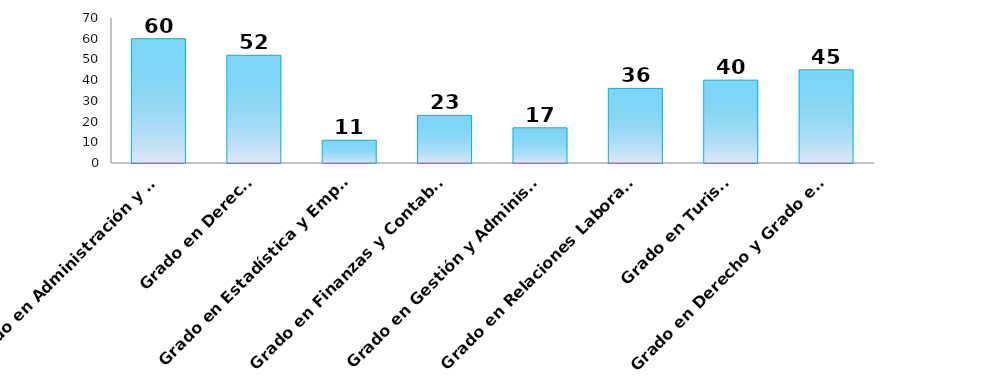
| Category | Series 0 |
|---|---|
| Grado en Administración y Dirección de Empresas | 60 |
| Grado en Derecho | 52 |
| Grado en Estadística y Empresa | 11 |
| Grado en Finanzas y Contabiilidad | 23 |
| Grado en Gestión y Administración Pública | 17 |
| Grado en Relaciones Laborales y Recursos Humanos | 36 |
| Grado en Turismo | 40 |
| Grado en Derecho y Grado en Administración y Dirección de Empresas | 45 |